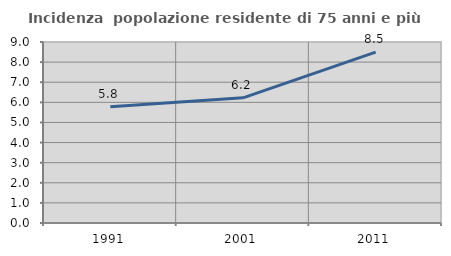
| Category | Incidenza  popolazione residente di 75 anni e più |
|---|---|
| 1991.0 | 5.785 |
| 2001.0 | 6.225 |
| 2011.0 | 8.496 |